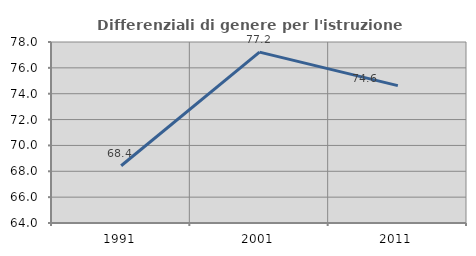
| Category | Differenziali di genere per l'istruzione superiore |
|---|---|
| 1991.0 | 68.429 |
| 2001.0 | 77.219 |
| 2011.0 | 74.627 |